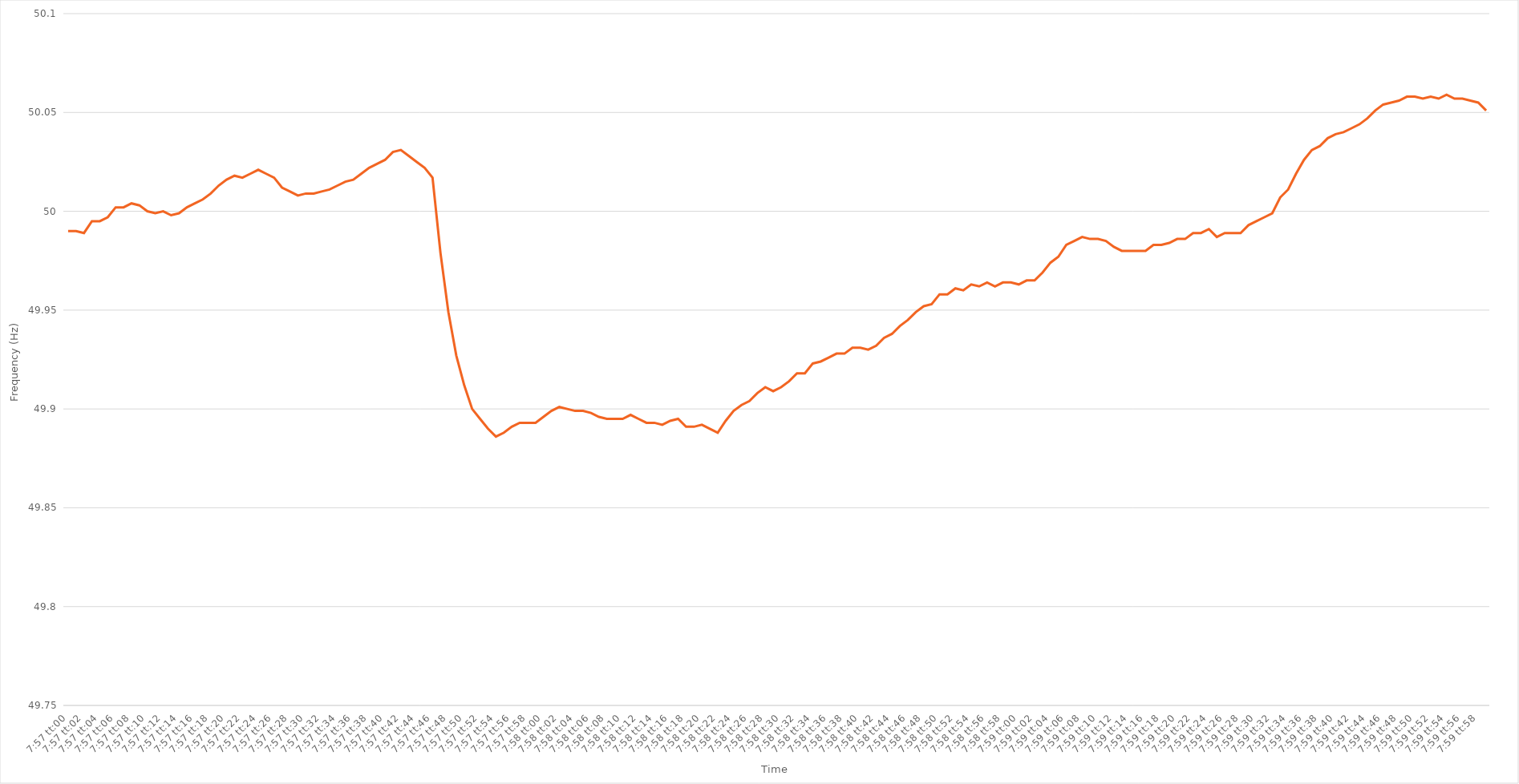
| Category | Series 0 |
|---|---|
| 0.33125 | 49.99 |
| 0.3312615740740741 | 49.99 |
| 0.3312731481481482 | 49.989 |
| 0.3312847222222222 | 49.995 |
| 0.3312962962962963 | 49.995 |
| 0.3313078703703704 | 49.997 |
| 0.33131944444444444 | 50.002 |
| 0.33133101851851854 | 50.002 |
| 0.3313425925925926 | 50.004 |
| 0.33135416666666667 | 50.003 |
| 0.3313657407407407 | 50 |
| 0.3313773148148148 | 49.999 |
| 0.3313888888888889 | 50 |
| 0.33140046296296294 | 49.998 |
| 0.33141203703703703 | 49.999 |
| 0.3314236111111111 | 50.002 |
| 0.33143518518518517 | 50.004 |
| 0.33144675925925926 | 50.006 |
| 0.33145833333333335 | 50.009 |
| 0.3314699074074074 | 50.013 |
| 0.3314814814814815 | 50.016 |
| 0.3314930555555556 | 50.018 |
| 0.3315046296296296 | 50.017 |
| 0.3315162037037037 | 50.019 |
| 0.3315277777777778 | 50.021 |
| 0.33153935185185185 | 50.019 |
| 0.33155092592592594 | 50.017 |
| 0.3315625 | 50.012 |
| 0.3315740740740741 | 50.01 |
| 0.3315856481481481 | 50.008 |
| 0.3315972222222222 | 50.009 |
| 0.3316087962962963 | 50.009 |
| 0.33162037037037034 | 50.01 |
| 0.33163194444444444 | 50.011 |
| 0.33164351851851853 | 50.013 |
| 0.33165509259259257 | 50.015 |
| 0.33166666666666667 | 50.016 |
| 0.33167824074074076 | 50.019 |
| 0.3316898148148148 | 50.022 |
| 0.3317013888888889 | 50.024 |
| 0.331712962962963 | 50.026 |
| 0.331724537037037 | 50.03 |
| 0.3317361111111111 | 50.031 |
| 0.3317476851851852 | 50.028 |
| 0.33175925925925925 | 50.025 |
| 0.33177083333333335 | 50.022 |
| 0.3317824074074074 | 50.017 |
| 0.3317939814814815 | 49.979 |
| 0.3318055555555555 | 49.949 |
| 0.33181712962962967 | 49.927 |
| 0.3318287037037037 | 49.912 |
| 0.33184027777777775 | 49.9 |
| 0.33185185185185184 | 49.895 |
| 0.33186342592592594 | 49.89 |
| 0.331875 | 49.886 |
| 0.33188657407407407 | 49.888 |
| 0.33189814814814816 | 49.891 |
| 0.3319097222222222 | 49.893 |
| 0.3319212962962963 | 49.893 |
| 0.3319328703703704 | 49.893 |
| 0.33194444444444443 | 49.896 |
| 0.3319560185185185 | 49.899 |
| 0.3319675925925926 | 49.901 |
| 0.33197916666666666 | 49.9 |
| 0.33199074074074075 | 49.899 |
| 0.33200231481481485 | 49.899 |
| 0.3320138888888889 | 49.898 |
| 0.3320254629629629 | 49.896 |
| 0.3320370370370371 | 49.895 |
| 0.3320486111111111 | 49.895 |
| 0.33206018518518515 | 49.895 |
| 0.33207175925925925 | 49.897 |
| 0.33208333333333334 | 49.895 |
| 0.3320949074074074 | 49.893 |
| 0.3321064814814815 | 49.893 |
| 0.33211805555555557 | 49.892 |
| 0.3321296296296296 | 49.894 |
| 0.3321412037037037 | 49.895 |
| 0.3321527777777778 | 49.891 |
| 0.33216435185185184 | 49.891 |
| 0.33217592592592593 | 49.892 |
| 0.3321875 | 49.89 |
| 0.33219907407407406 | 49.888 |
| 0.33221064814814816 | 49.894 |
| 0.33222222222222225 | 49.899 |
| 0.3322337962962963 | 49.902 |
| 0.33224537037037033 | 49.904 |
| 0.3322569444444445 | 49.908 |
| 0.3322685185185185 | 49.911 |
| 0.3322800925925926 | 49.909 |
| 0.33229166666666665 | 49.911 |
| 0.33230324074074075 | 49.914 |
| 0.3323148148148148 | 49.918 |
| 0.3323263888888889 | 49.918 |
| 0.332337962962963 | 49.923 |
| 0.332349537037037 | 49.924 |
| 0.3323611111111111 | 49.926 |
| 0.3323726851851852 | 49.928 |
| 0.33238425925925924 | 49.928 |
| 0.33239583333333333 | 49.931 |
| 0.33240740740740743 | 49.931 |
| 0.33241898148148147 | 49.93 |
| 0.33243055555555556 | 49.932 |
| 0.33244212962962966 | 49.936 |
| 0.3324537037037037 | 49.938 |
| 0.3324652777777778 | 49.942 |
| 0.3324768518518519 | 49.945 |
| 0.3324884259259259 | 49.949 |
| 0.3325 | 49.952 |
| 0.33251157407407406 | 49.953 |
| 0.33252314814814815 | 49.958 |
| 0.3325347222222222 | 49.958 |
| 0.3325462962962963 | 49.961 |
| 0.3325578703703704 | 49.96 |
| 0.3325694444444444 | 49.963 |
| 0.3325810185185185 | 49.962 |
| 0.3325925925925926 | 49.964 |
| 0.33260416666666665 | 49.962 |
| 0.33261574074074074 | 49.964 |
| 0.33262731481481483 | 49.964 |
| 0.3326388888888889 | 49.963 |
| 0.33265046296296297 | 49.965 |
| 0.33266203703703706 | 49.965 |
| 0.3326736111111111 | 49.969 |
| 0.3326851851851852 | 49.974 |
| 0.3326967592592593 | 49.977 |
| 0.33270833333333333 | 49.983 |
| 0.3327199074074074 | 49.985 |
| 0.33273148148148146 | 49.987 |
| 0.33274305555555556 | 49.986 |
| 0.3327546296296296 | 49.986 |
| 0.3327662037037037 | 49.985 |
| 0.3327777777777778 | 49.982 |
| 0.3327893518518518 | 49.98 |
| 0.3328009259259259 | 49.98 |
| 0.3328125 | 49.98 |
| 0.33282407407407405 | 49.98 |
| 0.33283564814814814 | 49.983 |
| 0.33284722222222224 | 49.983 |
| 0.3328587962962963 | 49.984 |
| 0.33287037037037037 | 49.986 |
| 0.33288194444444447 | 49.986 |
| 0.3328935185185185 | 49.989 |
| 0.3329050925925926 | 49.989 |
| 0.3329166666666667 | 49.991 |
| 0.33292824074074073 | 49.987 |
| 0.3329398148148148 | 49.989 |
| 0.3329513888888889 | 49.989 |
| 0.33296296296296296 | 49.989 |
| 0.332974537037037 | 49.993 |
| 0.33298611111111115 | 49.995 |
| 0.3329976851851852 | 49.997 |
| 0.3330092592592592 | 49.999 |
| 0.3330208333333333 | 50.007 |
| 0.3330324074074074 | 50.011 |
| 0.33304398148148145 | 50.019 |
| 0.33305555555555555 | 50.026 |
| 0.33306712962962964 | 50.031 |
| 0.3330787037037037 | 50.033 |
| 0.3330902777777778 | 50.037 |
| 0.33310185185185187 | 50.039 |
| 0.3331134259259259 | 50.04 |
| 0.333125 | 50.042 |
| 0.3331365740740741 | 50.044 |
| 0.33314814814814814 | 50.047 |
| 0.33315972222222223 | 50.051 |
| 0.3331712962962963 | 50.054 |
| 0.33318287037037037 | 50.055 |
| 0.3331944444444444 | 50.056 |
| 0.33320601851851855 | 50.058 |
| 0.3332175925925926 | 50.058 |
| 0.3332291666666667 | 50.057 |
| 0.3332407407407407 | 50.058 |
| 0.3332523148148148 | 50.057 |
| 0.33326388888888886 | 50.059 |
| 0.33327546296296295 | 50.057 |
| 0.33328703703703705 | 50.057 |
| 0.3332986111111111 | 50.056 |
| 0.3333101851851852 | 50.055 |
| 0.3333217592592593 | 50.051 |